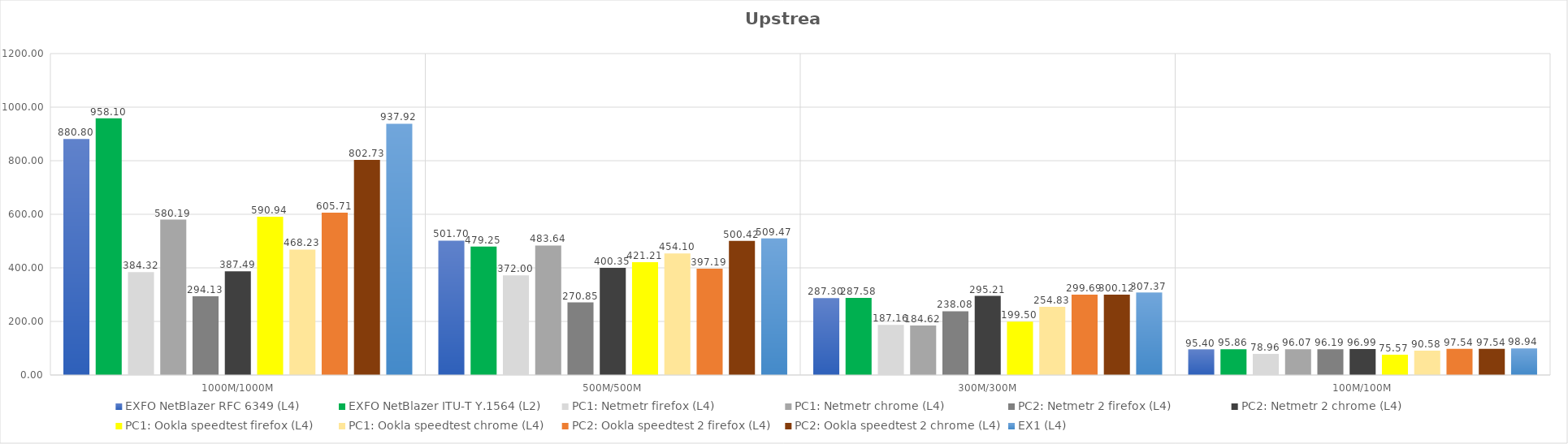
| Category | EXFO NetBlazer RFC 6349 (L4) | EXFO NetBlazer ITU-T Y.1564 (L2) | PC1: Netmetr firefox (L4) | PC1: Netmetr chrome (L4) | PC2: Netmetr 2 firefox (L4) | PC2: Netmetr 2 chrome (L4) | PC1: Ookla speedtest firefox (L4) | PC1: Ookla speedtest chrome (L4) | PC2: Ookla speedtest 2 firefox (L4) | PC2: Ookla speedtest 2 chrome (L4) | EX1 (L4) | Series 6 |
|---|---|---|---|---|---|---|---|---|---|---|---|---|
| 1000M/1000M | 880.8 | 958.096 | 384.321 | 580.194 | 294.127 | 387.49 | 590.94 | 468.23 | 605.71 | 802.73 | 937.92 |  |
| 500M/500M | 501.7 | 479.25 | 371.995 | 483.642 | 270.848 | 400.351 | 421.21 | 454.1 | 397.19 | 500.42 | 509.47 |  |
| 300M/300M | 287.3 | 287.578 | 187.163 | 184.62 | 238.075 | 295.214 | 199.5 | 254.83 | 299.69 | 300.12 | 307.37 |  |
| 100M/100M | 95.4 | 95.86 | 78.962 | 96.074 | 96.191 | 96.987 | 75.57 | 90.58 | 97.54 | 97.54 | 98.94 |  |